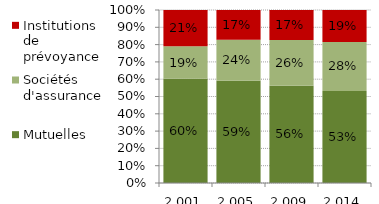
| Category | Mutuelles | Sociétés d'assurance | Institutions de prévoyance |
|---|---|---|---|
| 2001.0 | 0.603 | 0.187 | 0.21 |
| 2005.0 | 0.591 | 0.237 | 0.173 |
| 2009.0 | 0.562 | 0.264 | 0.173 |
| 2014.0 | 0.532 | 0.282 | 0.186 |